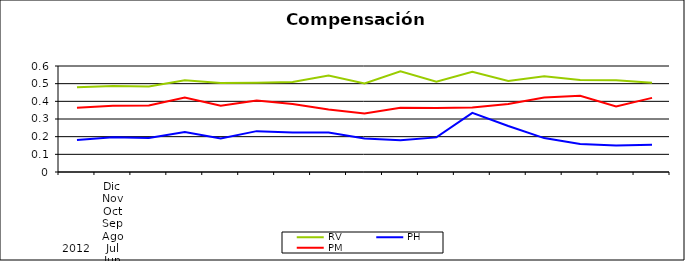
| Category | RV | PH | PM |
|---|---|---|---|
| 0 | 0.479 | 0.181 | 0.364 |
| 1 | 0.487 | 0.196 | 0.375 |
| 2 | 0.484 | 0.192 | 0.376 |
| 3 | 0.52 | 0.226 | 0.421 |
| 4 | 0.504 | 0.189 | 0.375 |
| 5 | 0.506 | 0.231 | 0.404 |
| 6 | 0.51 | 0.224 | 0.384 |
| 7 | 0.546 | 0.223 | 0.353 |
| 8 | 0.501 | 0.19 | 0.331 |
| 9 | 0.57 | 0.18 | 0.364 |
| 10 | 0.511 | 0.196 | 0.363 |
| 11 | 0.567 | 0.335 | 0.365 |
| 12 | 0.515 | 0.26 | 0.385 |
| 13 | 0.543 | 0.192 | 0.422 |
| 14 | 0.52 | 0.158 | 0.431 |
| 15 | 0.519 | 0.15 | 0.371 |
| 16 | 0.505 | 0.154 | 0.42 |